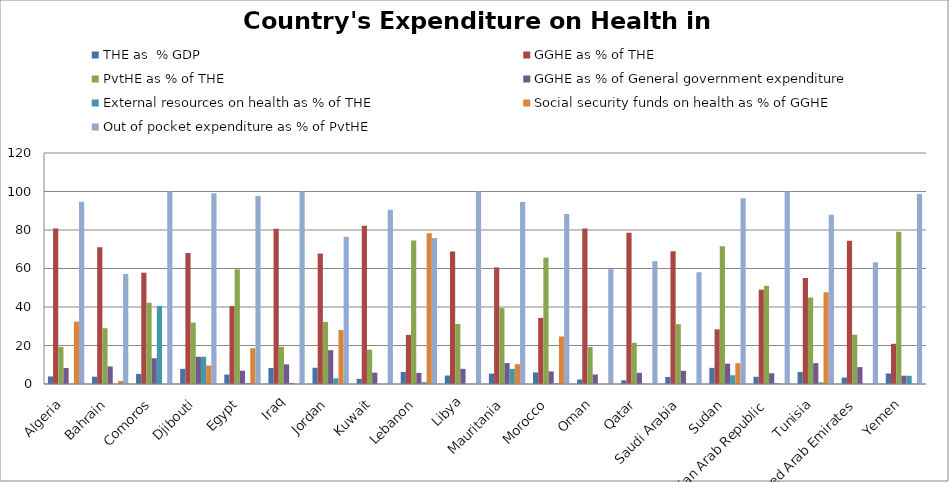
| Category | THE as  % GDP | GGHE as % of THE | PvtHE as % of THE  | GGHE as % of General government expenditure  | External resources on health as % of THE  | Social security funds on health as % of GGHE | Out of pocket expenditure as % of PvtHE |
|---|---|---|---|---|---|---|---|
| Algeria | 3.926 | 80.756 | 19.244 | 8.313 | 0.044 | 32.397 | 94.683 |
| Bahrain | 3.791 | 71.03 | 28.97 | 9.165 | 0 | 1.572 | 57.162 |
| Comoros | 5.258 | 57.826 | 42.174 | 13.369 | 40.544 | 0 | 100 |
| Djibouti | 7.871 | 68.086 | 31.914 | 14.146 | 14.165 | 9.58 | 99.081 |
| Egypt | 4.875 | 40.471 | 59.529 | 6.903 | 0.53 | 18.604 | 97.724 |
| Iraq | 8.304 | 80.685 | 19.315 | 10.204 | 0.567 | 0 | 100 |
| Jordan | 8.424 | 67.741 | 32.259 | 17.565 | 2.951 | 28.035 | 76.505 |
| Kuwait | 2.659 | 82.171 | 17.829 | 5.911 | 0 | 0 | 90.563 |
| Lebanon | 6.281 | 25.504 | 74.496 | 5.788 | 0.964 | 78.303 | 75.803 |
| Libya | 4.39 | 68.794 | 31.206 | 7.874 | 0.032 | 0 | 100 |
| Mauritania | 5.395 | 60.563 | 39.437 | 10.856 | 7.859 | 10.302 | 94.513 |
| Morocco | 6.031 | 34.348 | 65.652 | 6.534 | 0.355 | 24.672 | 88.335 |
| Oman | 2.342 | 80.813 | 19.187 | 4.926 | 0 | 0 | 59.661 |
| Qatar | 1.914 | 78.609 | 21.391 | 5.814 | 0 | 0 | 63.805 |
| Saudi Arabia | 3.689 | 68.931 | 31.069 | 6.844 | 0 | 0 | 58.061 |
| Sudan | 8.387 | 28.394 | 71.606 | 10.575 | 4.545 | 10.823 | 96.517 |
| Syrian Arab Republic | 3.74 | 49.003 | 50.997 | 5.58 | 0.444 | 0 | 100 |
| Tunisia | 6.23 | 55.078 | 44.922 | 10.847 | 0.88 | 47.676 | 87.879 |
| United Arab Emirates | 3.346 | 74.389 | 25.611 | 8.805 | 0 | 0 | 63.194 |
| Yemen | 5.465 | 20.887 | 79.113 | 4.304 | 4.244 | 0 | 98.659 |